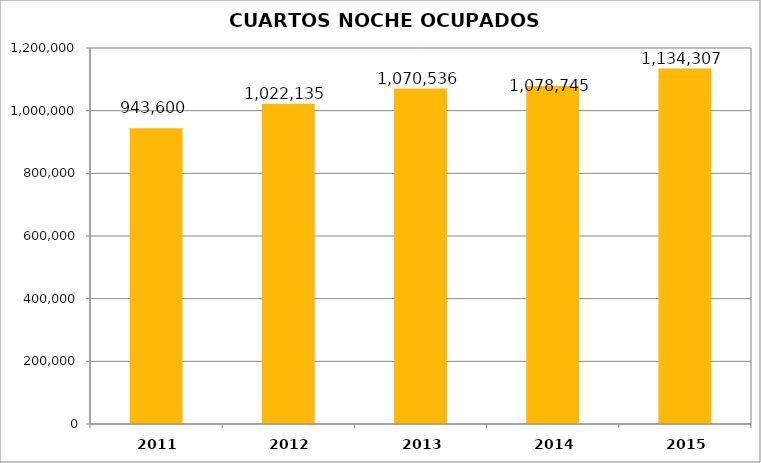
| Category | CUARTOS NOCHE OCUPADOS MENSUAL |
|---|---|
| 2011.0 | 943600 |
| 2012.0 | 1022135 |
| 2013.0 | 1070536 |
| 2014.0 | 1078745 |
| 2015.0 | 1134307 |